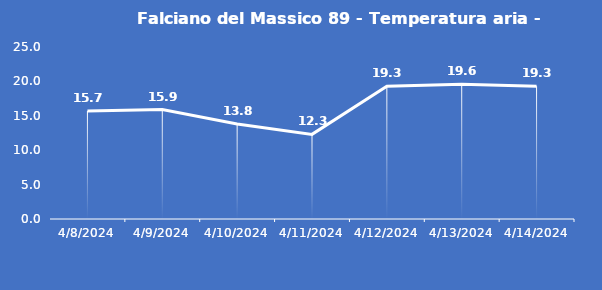
| Category | Falciano del Massico 89 - Temperatura aria - Grezzo (°C) |
|---|---|
| 4/8/24 | 15.7 |
| 4/9/24 | 15.9 |
| 4/10/24 | 13.8 |
| 4/11/24 | 12.3 |
| 4/12/24 | 19.3 |
| 4/13/24 | 19.6 |
| 4/14/24 | 19.3 |